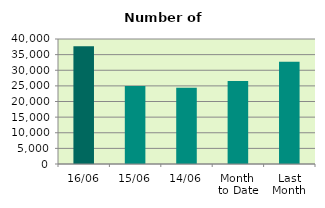
| Category | Series 0 |
|---|---|
| 16/06 | 37652 |
| 15/06 | 24994 |
| 14/06 | 24378 |
| Month 
to Date | 26559 |
| Last
Month | 32723.818 |